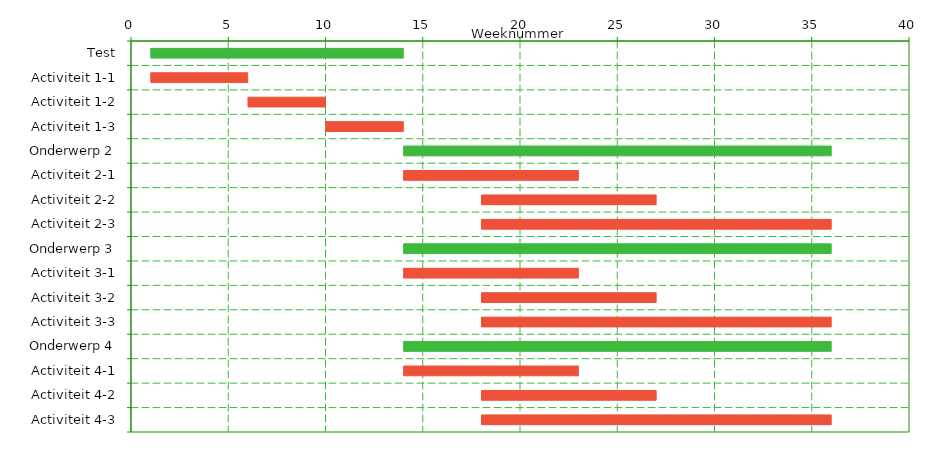
| Category | Start | duur in weken |
|---|---|---|
| Test | 1 | 13 |
| Activiteit 1-1 | 1 | 5 |
| Activiteit 1-2 | 6 | 4 |
| Activiteit 1-3 | 10 | 4 |
| Onderwerp 2 | 14 | 22 |
| Activiteit 2-1 | 14 | 9 |
| Activiteit 2-2 | 18 | 9 |
| Activiteit 2-3 | 18 | 18 |
| Onderwerp 3 | 14 | 22 |
| Activiteit 3-1 | 14 | 9 |
| Activiteit 3-2 | 18 | 9 |
| Activiteit 3-3 | 18 | 18 |
| Onderwerp 4 | 14 | 22 |
| Activiteit 4-1 | 14 | 9 |
| Activiteit 4-2 | 18 | 9 |
| Activiteit 4-3 | 18 | 18 |